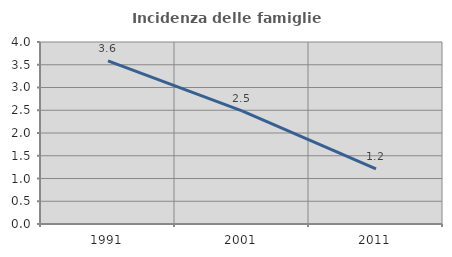
| Category | Incidenza delle famiglie numerose |
|---|---|
| 1991.0 | 3.583 |
| 2001.0 | 2.488 |
| 2011.0 | 1.21 |